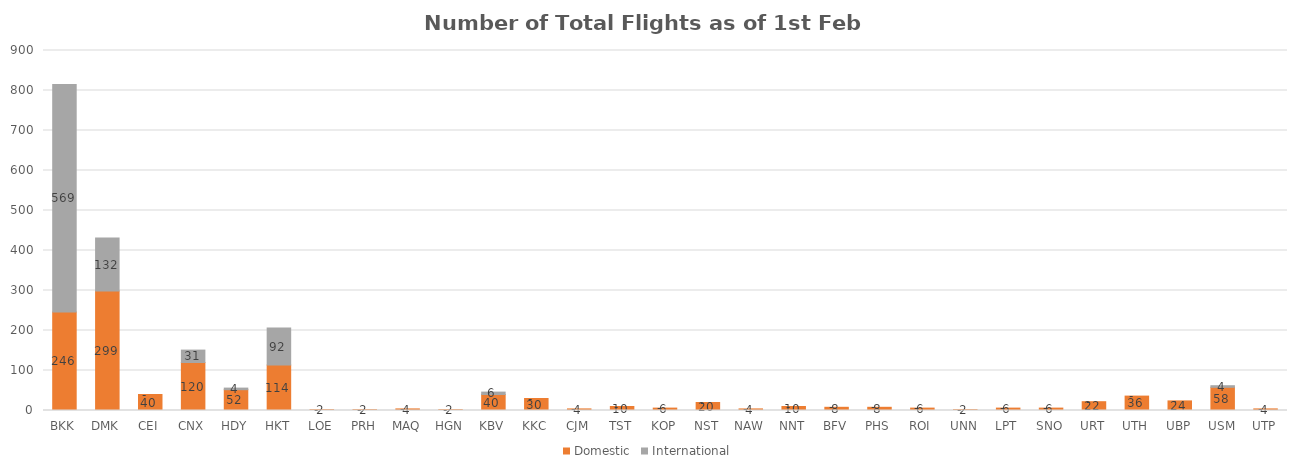
| Category | Domestic | International |
|---|---|---|
| BKK | 246 | 569 |
| DMK | 299 | 132 |
| CEI | 40 | 0 |
| CNX | 120 | 31 |
| HDY | 52 | 4 |
| HKT | 114 | 92 |
| LOE | 2 | 0 |
| PRH | 2 | 0 |
| MAQ | 4 | 0 |
| HGN | 2 | 0 |
| KBV | 40 | 6 |
| KKC | 30 | 0 |
| CJM | 4 | 0 |
| TST | 10 | 0 |
| KOP | 6 | 0 |
| NST | 20 | 0 |
| NAW | 4 | 0 |
| NNT | 10 | 0 |
| BFV | 8 | 0 |
| PHS | 8 | 0 |
| ROI | 6 | 0 |
| UNN | 2 | 0 |
| LPT | 6 | 0 |
| SNO | 6 | 0 |
| URT | 22 | 0 |
| UTH | 36 | 0 |
| UBP | 24 | 0 |
| USM | 58 | 4 |
| UTP | 4 | 0 |